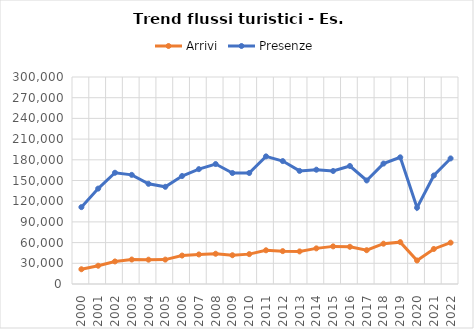
| Category | Arrivi | Presenze |
|---|---|---|
| 2000.0 | 21377 | 111394 |
| 2001.0 | 26488 | 138257 |
| 2002.0 | 32672 | 161229 |
| 2003.0 | 35463 | 158158 |
| 2004.0 | 35239 | 145191 |
| 2005.0 | 35353 | 140859 |
| 2006.0 | 41233 | 156504 |
| 2007.0 | 42824 | 166446 |
| 2008.0 | 43849 | 173862 |
| 2009.0 | 41690 | 160873 |
| 2010.0 | 43289 | 160885 |
| 2011.0 | 48844 | 184958 |
| 2012.0 | 47639 | 178146 |
| 2013.0 | 47225 | 163914 |
| 2014.0 | 51635 | 165664 |
| 2015.0 | 54520 | 163781 |
| 2016.0 | 53922 | 171031 |
| 2017.0 | 48983 | 150075 |
| 2018.0 | 58405 | 174532 |
| 2019.0 | 60674 | 183590 |
| 2020.0 | 34083 | 110508 |
| 2021.0 | 50768 | 157256 |
| 2022.0 | 59896 | 181990 |